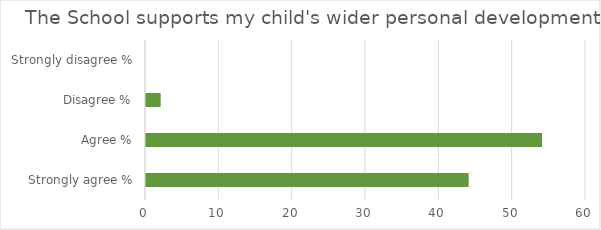
| Category | Series 1 |
|---|---|
| Strongly agree % | 44 |
| Agree % | 54 |
| Disagree % | 2 |
| Strongly disagree % | 0 |